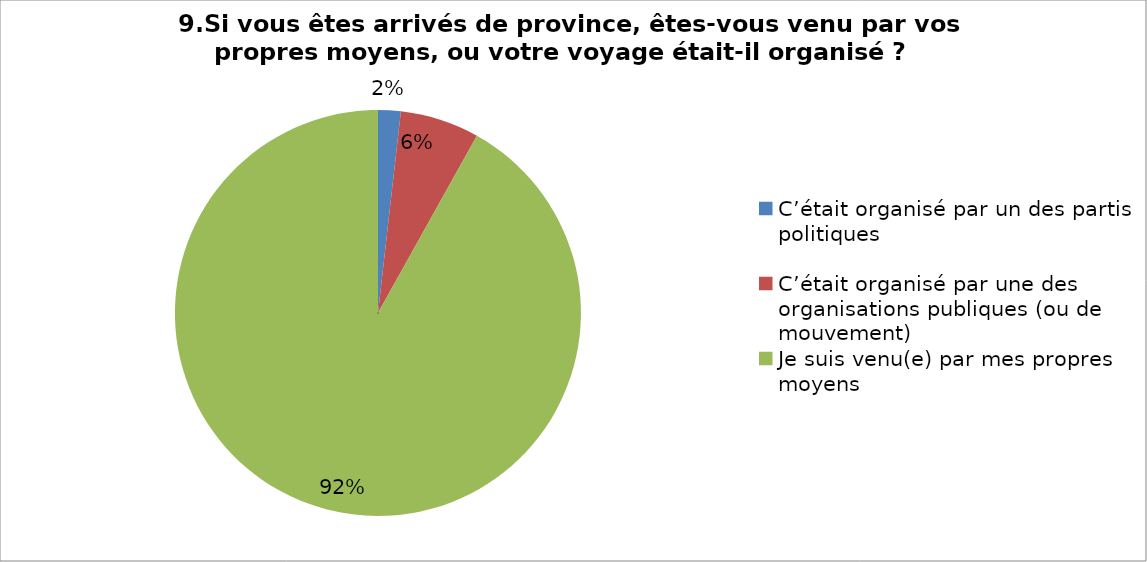
| Category | Series 0 |
|---|---|
| C’était organisé par un des partis politiques | 1.8 |
| C’était organisé par une des organisations publiques (ou de mouvement)  | 6.3 |
| Je suis venu(e) par mes propres moyens  | 91.9 |